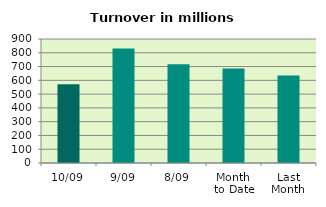
| Category | Series 0 |
|---|---|
| 10/09 | 571.308 |
| 9/09 | 830.202 |
| 8/09 | 716.515 |
| Month 
to Date | 685.665 |
| Last
Month | 635.477 |